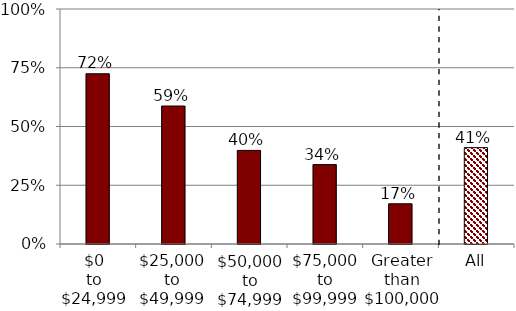
| Category | SHED |
|---|---|
| $0 to $24,999 | 0.724 |
| $25,000 to $49,999 | 0.587 |
| $50,000 to $74,999 | 0.398 |
| $75,000 to $99,999 | 0.338 |
| Greater than $100,000 | 0.171 |
| All | 0.41 |